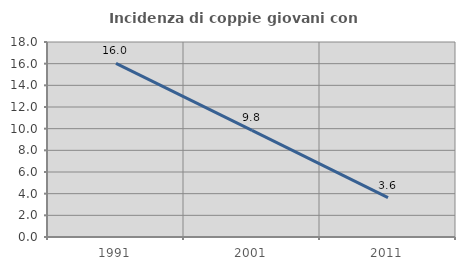
| Category | Incidenza di coppie giovani con figli |
|---|---|
| 1991.0 | 16.028 |
| 2001.0 | 9.843 |
| 2011.0 | 3.636 |